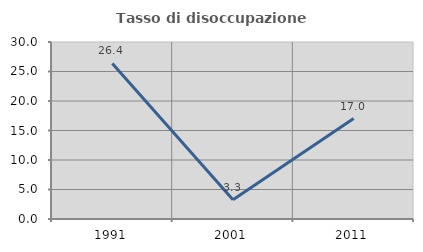
| Category | Tasso di disoccupazione giovanile  |
|---|---|
| 1991.0 | 26.364 |
| 2001.0 | 3.279 |
| 2011.0 | 17.021 |